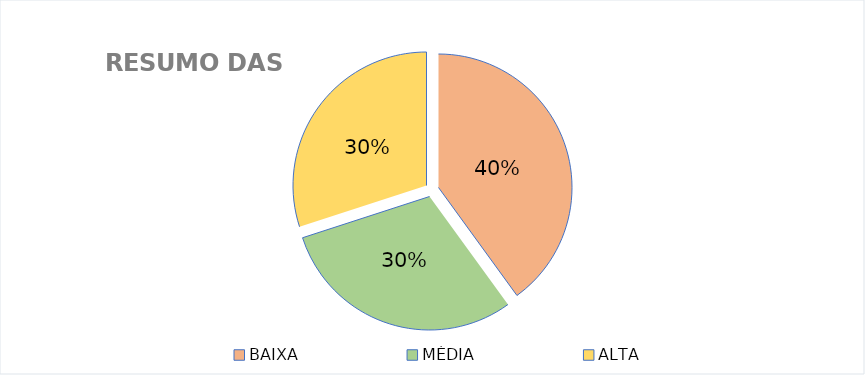
| Category | Series 0 |
|---|---|
| BAIXA | 4 |
| MÉDIA | 3 |
| ALTA | 3 |